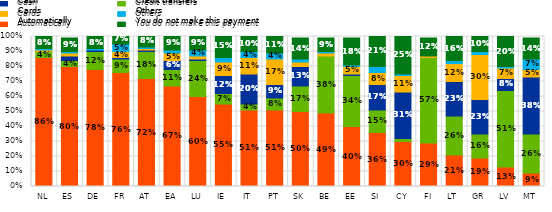
| Category | Automatically | Credit transfers  | Cash | Cards | Others | You do not make this payment  |
|---|---|---|---|---|---|---|
| NL | 0.86 | 0.04 | 0 | 0.01 | 0.01 | 0.08 |
| ES | 0.8 | 0.04 | 0.03 | 0.02 | 0.01 | 0.09 |
| DE | 0.78 | 0.12 | 0.01 | 0 | 0.01 | 0.08 |
| FR | 0.76 | 0.09 | 0.01 | 0.04 | 0.05 | 0.07 |
| AT | 0.72 | 0.18 | 0.01 | 0.01 | 0.01 | 0.08 |
| EA | 0.67 | 0.11 | 0.06 | 0.05 | 0.02 | 0.09 |
| LU | 0.6 | 0.24 | 0.01 | 0.02 | 0.04 | 0.09 |
| IE | 0.55 | 0.07 | 0.12 | 0.09 | 0.03 | 0.15 |
| IT | 0.51 | 0.04 | 0.2 | 0.11 | 0.04 | 0.1 |
| PT | 0.51 | 0.08 | 0.09 | 0.17 | 0.04 | 0.11 |
| SK | 0.5 | 0.17 | 0.13 | 0.03 | 0.02 | 0.14 |
| BE | 0.49 | 0.38 | 0 | 0.02 | 0.01 | 0.09 |
| EE | 0.4 | 0.34 | 0.01 | 0.05 | 0.01 | 0.18 |
| SI | 0.36 | 0.15 | 0.17 | 0.08 | 0.04 | 0.21 |
| CY | 0.3 | 0.02 | 0.31 | 0.11 | 0.01 | 0.25 |
| FI | 0.29 | 0.57 | 0 | 0.01 | 0 | 0.12 |
| LT | 0.21 | 0.26 | 0.23 | 0.12 | 0.02 | 0.16 |
| GR | 0.19 | 0.16 | 0.23 | 0.3 | 0.02 | 0.1 |
| LV | 0.13 | 0.51 | 0.08 | 0.07 | 0.01 | 0.2 |
| MT | 0.09 | 0.26 | 0.38 | 0.05 | 0.07 | 0.14 |